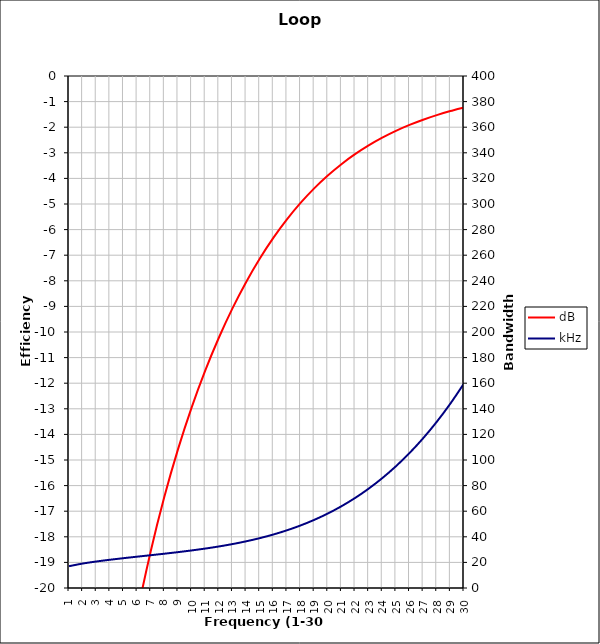
| Category | dB |
|---|---|
| 1 | -50.589 |
| 2 | -39.048 |
| 3 | -32.355 |
| 4 | -27.635 |
| 5 | -23.996 |
| 6 | -21.041 |
| 7 | -18.562 |
| 8 | -16.436 |
| 9 | -14.584 |
| 10 | -12.954 |
| 11 | -11.51 |
| 12 | -10.224 |
| 13 | -9.077 |
| 14 | -8.054 |
| 15 | -7.14 |
| 16 | -6.326 |
| 17 | -5.602 |
| 18 | -4.959 |
| 19 | -4.39 |
| 20 | -3.887 |
| 21 | -3.444 |
| 22 | -3.054 |
| 23 | -2.711 |
| 24 | -2.409 |
| 25 | -2.144 |
| 26 | -1.912 |
| 27 | -1.708 |
| 28 | -1.528 |
| 29 | -1.37 |
| 30 | -1.231 |